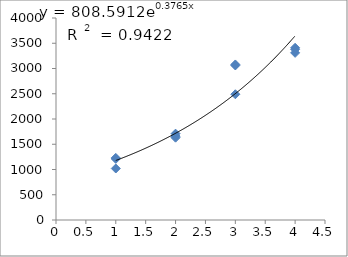
| Category | Series 0 |
|---|---|
| 1.0 | 1210 |
| 1.0 | 1020 |
| 1.0 | 1230 |
| 2.0 | 1710 |
| 2.0 | 1660 |
| 2.0 | 1630 |
| 3.0 | 3080 |
| 3.0 | 2490 |
| 3.0 | 3060 |
| 4.0 | 3310 |
| 4.0 | 3380 |
| 4.0 | 3410 |